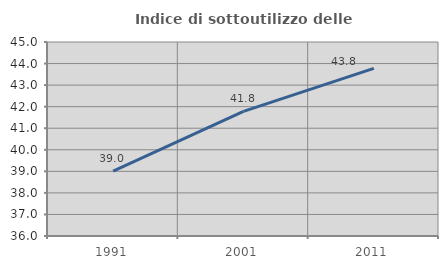
| Category | Indice di sottoutilizzo delle abitazioni  |
|---|---|
| 1991.0 | 39.01 |
| 2001.0 | 41.782 |
| 2011.0 | 43.774 |